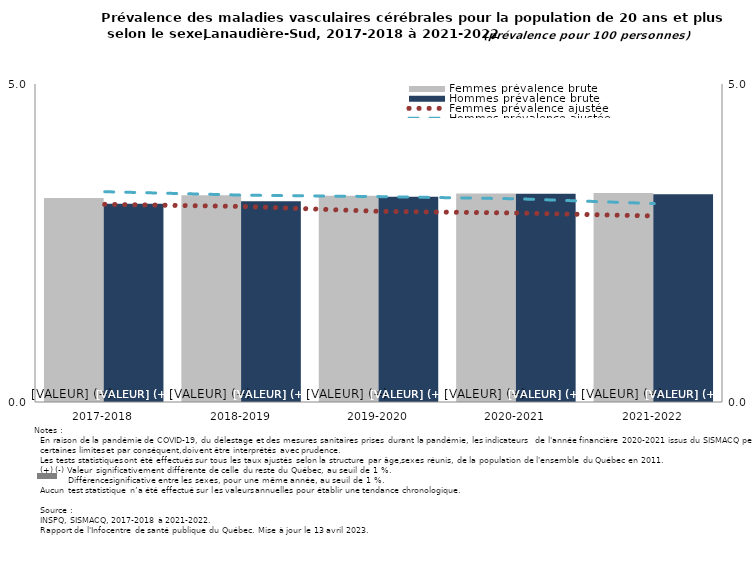
| Category | Femmes prévalence brute | Hommes prévalence brute |
|---|---|---|
| 2017-2018 | 3.207 | 3.115 |
| 2018-2019 | 3.251 | 3.157 |
| 2019-2020 | 3.245 | 3.229 |
| 2020-2021 | 3.277 | 3.274 |
| 2021-2022 | 3.286 | 3.266 |